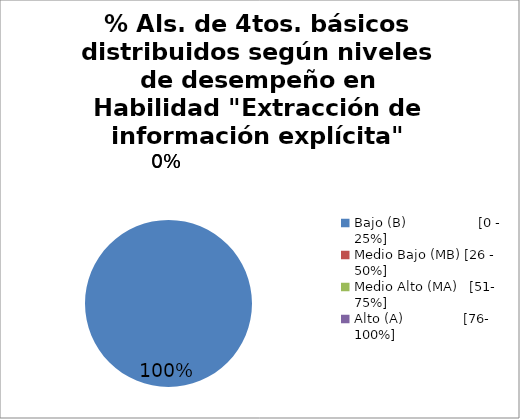
| Category | Series 0 |
|---|---|
| Bajo (B)                  [0 - 25%] | 1 |
| Medio Bajo (MB) [26 - 50%] | 0 |
| Medio Alto (MA)   [51- 75%] | 0 |
| Alto (A)               [76- 100%] | 0 |